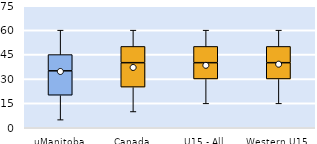
| Category | 25th | 50th | 75th |
|---|---|---|---|
| uManitoba | 20 | 15 | 10 |
| Canada | 25 | 15 | 10 |
| U15 - All | 30 | 10 | 10 |
| Western U15 | 30 | 10 | 10 |